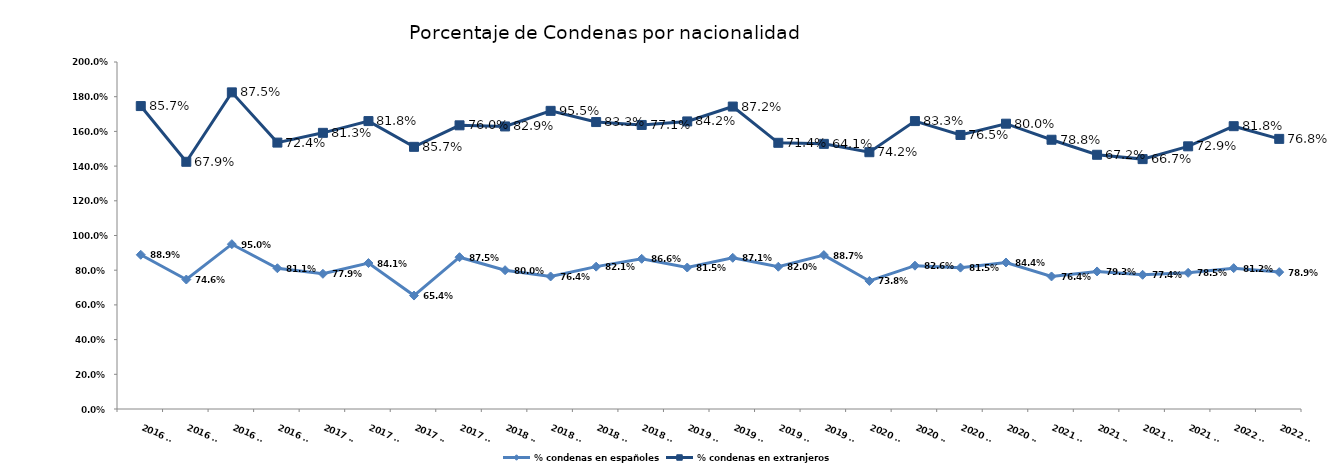
| Category | % condenas en españoles | % condenas en extranjeros |
|---|---|---|
| 2016 T1 | 0.889 | 0.857 |
| 2016 T2 | 0.746 | 0.679 |
| 2016 T3 | 0.95 | 0.875 |
| 2016 T4 | 0.811 | 0.724 |
| 2017 T1 | 0.779 | 0.812 |
| 2017 T2 | 0.841 | 0.818 |
| 2017 T3 | 0.654 | 0.857 |
| 2017 T4 | 0.875 | 0.76 |
| 2018 T1 | 0.8 | 0.829 |
| 2018 T2 | 0.764 | 0.955 |
| 2018 T3 | 0.821 | 0.833 |
| 2018 T4 | 0.866 | 0.771 |
| 2019 T1 | 0.815 | 0.842 |
| 2019 T2 | 0.871 | 0.872 |
| 2019 T3 | 0.82 | 0.714 |
| 2019 T4 | 0.887 | 0.641 |
| 2020 T1 | 0.738 | 0.742 |
| 2020 T2 | 0.826 | 0.833 |
| 2020 T3 | 0.815 | 0.765 |
| 2020 T4 | 0.844 | 0.8 |
| 2021 T1 | 0.764 | 0.788 |
| 2021 T2 | 0.793 | 0.672 |
| 2021 T3 | 0.774 | 0.667 |
| 2021 T4 | 0.785 | 0.729 |
| 2022 T1 | 0.812 | 0.818 |
| 2022 T2 | 0.789 | 0.768 |